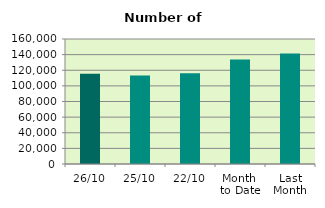
| Category | Series 0 |
|---|---|
| 26/10 | 115628 |
| 25/10 | 113338 |
| 22/10 | 116064 |
| Month 
to Date | 133646.667 |
| Last
Month | 141428.727 |